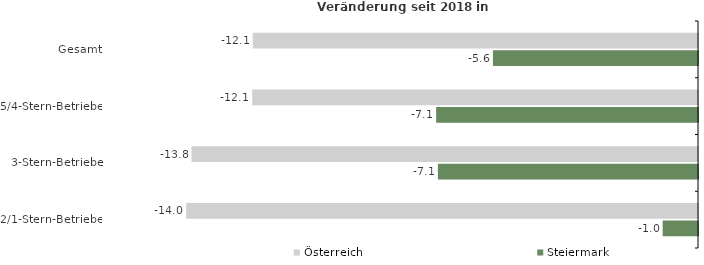
| Category | Österreich | Steiermark |
|---|---|---|
| Gesamt | -12.137 | -5.59 |
| 5/4-Stern-Betriebe | -12.15 | -7.138 |
| 3-Stern-Betriebe | -13.805 | -7.09 |
| 2/1-Stern-Betriebe | -13.951 | -0.963 |